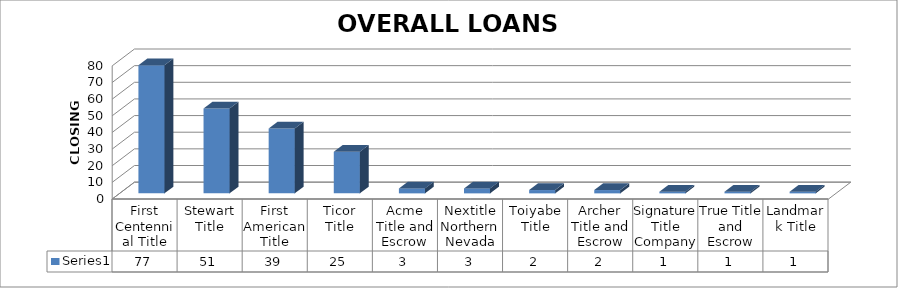
| Category | Series 0 |
|---|---|
| First Centennial Title | 77 |
| Stewart Title | 51 |
| First American Title | 39 |
| Ticor Title | 25 |
| Acme Title and Escrow | 3 |
| Nextitle Northern Nevada | 3 |
| Toiyabe Title | 2 |
| Archer Title and Escrow | 2 |
| Signature Title Company | 1 |
| True Title and Escrow | 1 |
| Landmark Title | 1 |